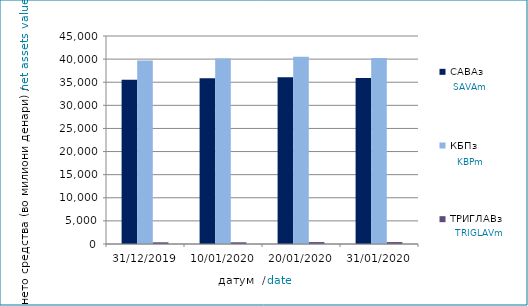
| Category | САВАз | КБПз | ТРИГЛАВз |
|---|---|---|---|
| 31/12/2019 | 35512.309 | 39715.32 | 369.168 |
| 10/01/2020 | 35873.943 | 40116.708 | 373.959 |
| 20/01/2020 | 36085.524 | 40504.451 | 415.91 |
| 31/01/2020 | 35902.868 | 40248.328 | 417.679 |